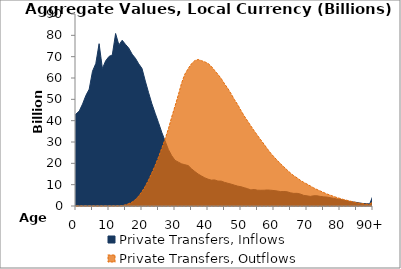
| Category | Private Transfers, Inflows | Private Transfers, Outflows |
|---|---|---|
| 0 | 43114.664 | 0 |
|  | 44554.877 | 0 |
| 2 | 47837.915 | 0 |
| 3 | 51825.532 | 0 |
| 4 | 54740.585 | 0 |
| 5 | 63168.351 | 0 |
| 6 | 66777.827 | 0 |
| 7 | 76078.96 | 0.046 |
| 8 | 64418.048 | 0.656 |
| 9 | 68074.997 | 0.657 |
| 10 | 70107.904 | 1.17 |
| 11 | 70794.211 | 2.596 |
| 12 | 80858.231 | 30.807 |
| 13 | 75491.61 | 48.309 |
| 14 | 77690.656 | 139.269 |
| 15 | 75749.829 | 569.197 |
| 16 | 73977.303 | 1121.228 |
| 17 | 71181.176 | 1820.289 |
| 18 | 69275.036 | 3012.458 |
| 19 | 66657.216 | 4653.695 |
| 20 | 64471.875 | 6766.219 |
| 21 | 58555.761 | 9263.787 |
| 22 | 53098.202 | 12251.55 |
| 23 | 47897.147 | 15607.704 |
| 24 | 43429.615 | 19040.489 |
| 25 | 39039.91 | 22931.374 |
| 26 | 34502.979 | 27101.749 |
| 27 | 30457.233 | 31387.422 |
| 28 | 26465.535 | 36173.199 |
| 29 | 23578.02 | 41719.071 |
| 30 | 21409.85 | 46763.162 |
| 31 | 20584.407 | 52073.239 |
| 32 | 19762.029 | 57653.868 |
| 33 | 19337.273 | 61823.742 |
| 34 | 18956.829 | 64418.108 |
| 35 | 17444.5 | 66708.912 |
| 36 | 16171.843 | 68155.18 |
| 37 | 15006.514 | 68679.816 |
| 38 | 14094.879 | 68135.999 |
| 39 | 13238 | 67589.469 |
| 40 | 12580.765 | 66829.954 |
| 41 | 12123.873 | 65473.059 |
| 42 | 12243.3 | 63552.413 |
| 43 | 11692.91 | 61742.591 |
| 44 | 11672.388 | 59726.613 |
| 45 | 11083.49 | 57306.501 |
| 46 | 10665.698 | 55111.437 |
| 47 | 10254.274 | 52618.576 |
| 48 | 9780.514 | 49899.34 |
| 49 | 9317.115 | 47515.413 |
| 50 | 9018.084 | 44733.917 |
| 51 | 8569.917 | 42152.494 |
| 52 | 8111.575 | 39847.408 |
| 53 | 7530.089 | 37501.01 |
| 54 | 7738.495 | 35257.254 |
| 55 | 7413.709 | 33069.011 |
| 56 | 7368.831 | 31001.735 |
| 57 | 7400.254 | 28920.733 |
| 58 | 7517.463 | 26771.282 |
| 59 | 7401.485 | 24774.442 |
| 60 | 7237.482 | 23032.624 |
| 61 | 7031.365 | 21380.662 |
| 62 | 6740.083 | 19779.114 |
| 63 | 6803.309 | 18346.161 |
| 64 | 6662.595 | 16857.576 |
| 65 | 6194.726 | 15438.871 |
| 66 | 5916.756 | 14207.413 |
| 67 | 5945.364 | 13185.421 |
| 68 | 5590.939 | 12038.589 |
| 69 | 4984.853 | 11100.759 |
| 70 | 4767.277 | 10282.72 |
| 71 | 4499.676 | 9413.466 |
| 72 | 4792.776 | 8520.941 |
| 73 | 4806.654 | 7744.404 |
| 74 | 4508.803 | 7070.064 |
| 75 | 4293.757 | 6374.667 |
| 76 | 4208.277 | 5664.321 |
| 77 | 3899.083 | 5096.61 |
| 78 | 3603.043 | 4532.977 |
| 79 | 3309.804 | 4004.962 |
| 80 | 3099.585 | 3535.38 |
| 81 | 2778.84 | 3082.028 |
| 82 | 2455.425 | 2716.682 |
| 83 | 2094.626 | 2327.174 |
| 84 | 1885.535 | 1929.727 |
| 85 | 1668.621 | 1583.868 |
| 86 | 1408.213 | 1289.337 |
| 87 | 1152.498 | 1059.324 |
| 88 | 1102.694 | 879.973 |
| 89 | 973.249 | 736.563 |
| 90+ | 4899.905 | 2395.509 |